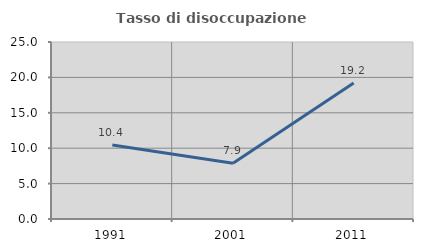
| Category | Tasso di disoccupazione giovanile  |
|---|---|
| 1991.0 | 10.443 |
| 2001.0 | 7.871 |
| 2011.0 | 19.222 |